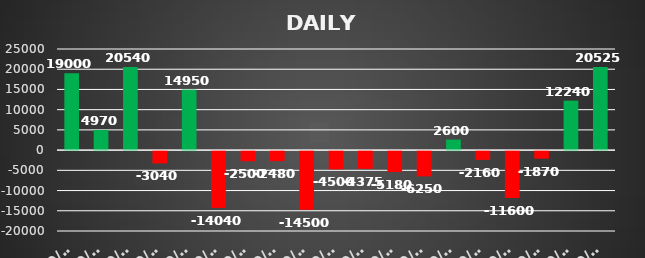
| Category | Series 0 |
|---|---|
| 2023-09-01 | 19000 |
| 2023-09-04 | 4970 |
| 2023-09-05 | 20540 |
| 2023-09-06 | -3040 |
| 2023-09-07 | 14950 |
| 2023-09-08 | -14040 |
| 2023-09-11 | -2500 |
| 2023-09-12 | -2480 |
| 2023-09-12 | -14500 |
| 2023-09-13 | -4500 |
| 2023-09-13 | -4375 |
| 2023-09-14 | -5180 |
| 2023-09-15 | -6250 |
| 2023-09-20 | 2600 |
| 2023-09-21 | -2160 |
| 2023-09-21 | -11600 |
| 2023-09-22 | -1870 |
| 2023-09-25 | 12240 |
| 2023-09-29 | 20525.2 |